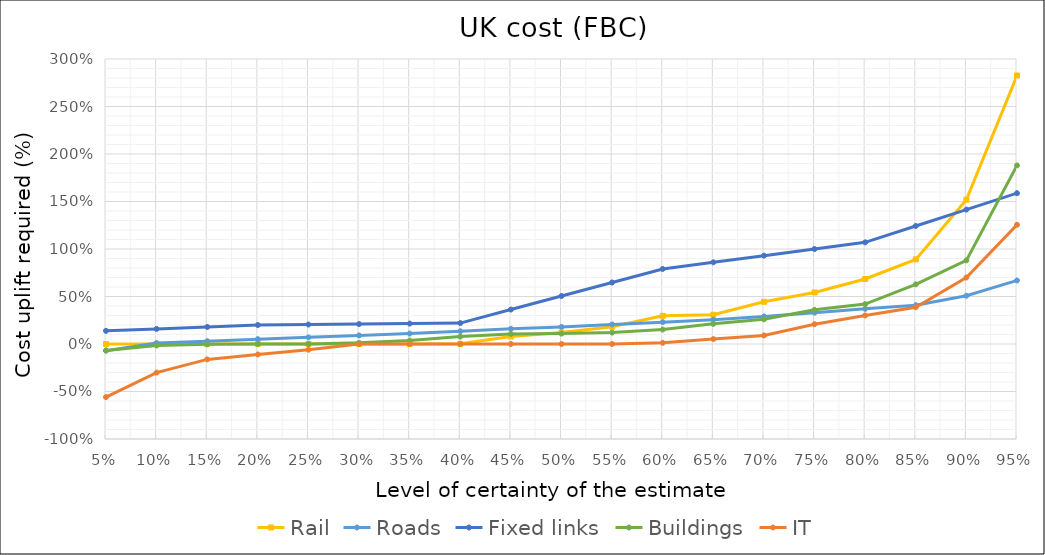
| Category | Rail | Roads | Fixed links | Buildings | IT |
|---|---|---|---|---|---|
| 0.05 | 0 | -0.07 | 0.138 | -0.068 | -0.559 |
| 0.1 | 0 | 0.01 | 0.159 | -0.015 | -0.301 |
| 0.15 | 0 | 0.03 | 0.179 | -0.003 | -0.162 |
| 0.2 | 0 | 0.051 | 0.2 | 0 | -0.11 |
| 0.25 | 0 | 0.07 | 0.205 | 0 | -0.06 |
| 0.3 | 0 | 0.09 | 0.21 | 0.012 | -0.001 |
| 0.35 | 0 | 0.11 | 0.215 | 0.036 | 0 |
| 0.4 | 0.002 | 0.134 | 0.22 | 0.078 | 0 |
| 0.45 | 0.079 | 0.16 | 0.363 | 0.106 | 0 |
| 0.5 | 0.121 | 0.18 | 0.505 | 0.11 | 0 |
| 0.55 | 0.182 | 0.206 | 0.648 | 0.12 | 0 |
| 0.6 | 0.296 | 0.23 | 0.79 | 0.152 | 0.012 |
| 0.65 | 0.308 | 0.257 | 0.86 | 0.212 | 0.052 |
| 0.7 | 0.444 | 0.29 | 0.93 | 0.26 | 0.09 |
| 0.75 | 0.542 | 0.33 | 1 | 0.36 | 0.209 |
| 0.8 | 0.684 | 0.37 | 1.07 | 0.42 | 0.301 |
| 0.85 | 0.89 | 0.408 | 1.242 | 0.628 | 0.387 |
| 0.9 | 1.518 | 0.508 | 1.415 | 0.88 | 0.7 |
| 0.95 | 2.826 | 0.669 | 1.588 | 1.88 | 1.255 |